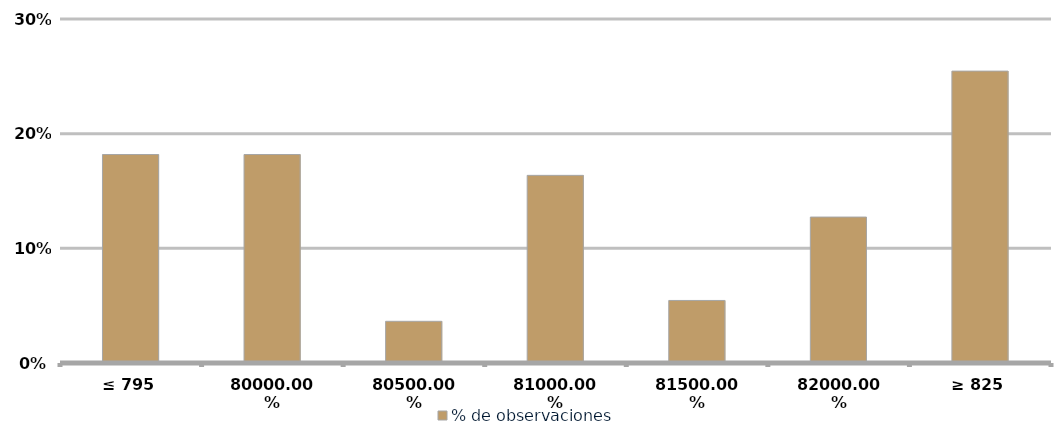
| Category | % de observaciones  |
|---|---|
| ≤ 795 | 0.182 |
| 800 | 0.182 |
| 805 | 0.036 |
| 810 | 0.164 |
| 815 | 0.055 |
| 820 | 0.127 |
| ≥ 825 | 0.255 |